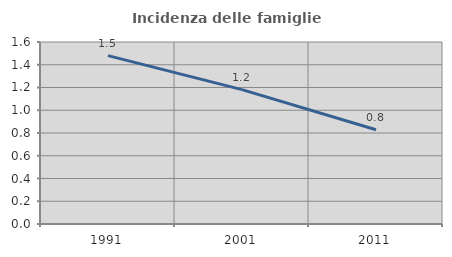
| Category | Incidenza delle famiglie numerose |
|---|---|
| 1991.0 | 1.48 |
| 2001.0 | 1.181 |
| 2011.0 | 0.829 |